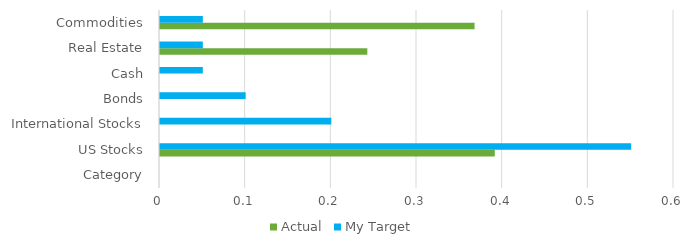
| Category | Actual | My Target |
|---|---|---|
| Category | 0 | 0 |
| US Stocks | 0.391 | 0.55 |
| International Stocks | 0 | 0.2 |
| Bonds | 0 | 0.1 |
| Cash | 0 | 0.05 |
| Real Estate | 0.242 | 0.05 |
| Commodities | 0.367 | 0.05 |